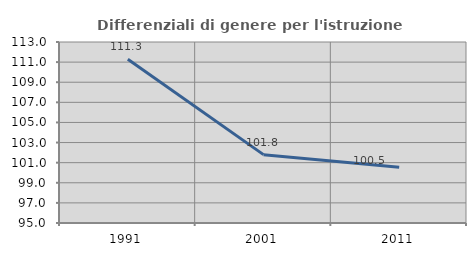
| Category | Differenziali di genere per l'istruzione superiore |
|---|---|
| 1991.0 | 111.289 |
| 2001.0 | 101.798 |
| 2011.0 | 100.536 |